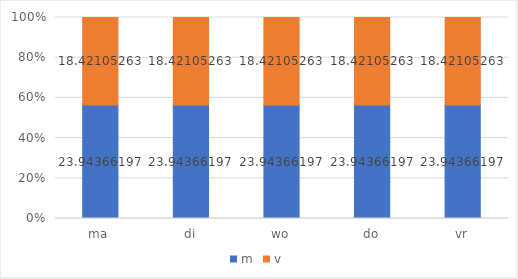
| Category | m | v |
|---|---|---|
| ma | 23.944 | 18.421 |
| di | 23.944 | 18.421 |
| wo | 23.944 | 18.421 |
| do | 23.944 | 18.421 |
| vr | 23.944 | 18.421 |